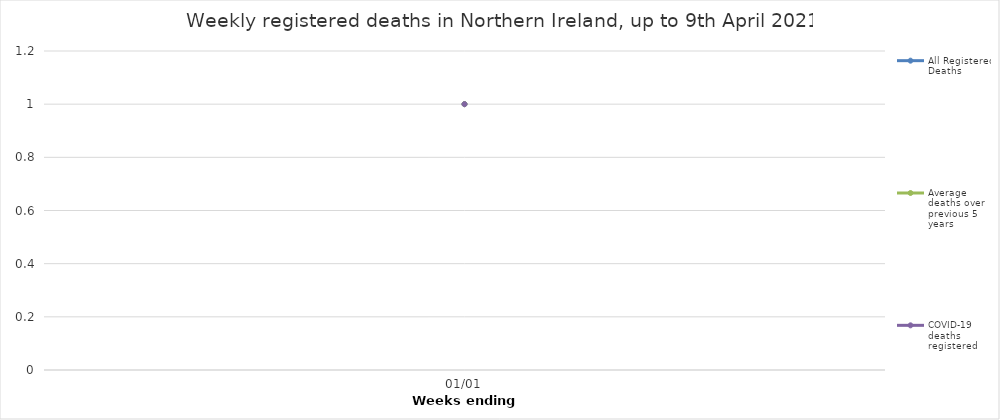
| Category | All Registered Deaths | Average deaths over previous 5 years | COVID-19 deaths registered |
|---|---|---|---|
| 0 | 1 | 1 | 1 |